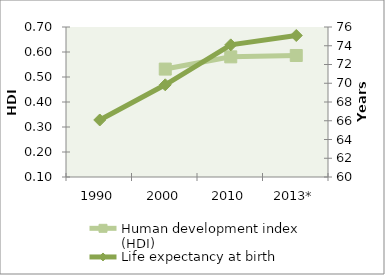
| Category | Human development index (HDI) |
|---|---|
| 1990 | 0 |
| 2000 | 0.532 |
| 2010 | 0.581 |
| 2013* | 0.586 |